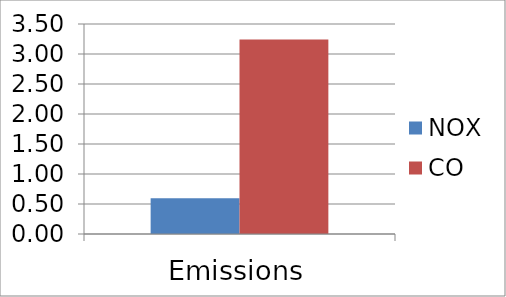
| Category | NOX | CO |
|---|---|---|
| Emissions | 0.596 | 3.241 |